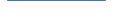
| Category | Series 0 |
|---|---|
| 0 | 119 |
| 1 | 144 |
| 2 | 145 |
| 3 | 112 |
| 4 | 133 |
| 5 | 125 |
| 6 | 131 |
| 7 | 138 |
| 8 | 160 |